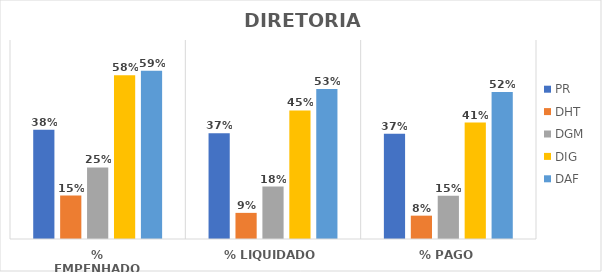
| Category | PR | DHT | DGM | DIG | DAF |
|---|---|---|---|---|---|
| % EMPENHADO | 0.384 | 0.153 | 0.252 | 0.576 | 0.592 |
| % LIQUIDADO | 0.372 | 0.092 | 0.184 | 0.452 | 0.528 |
| % PAGO | 0.37 | 0.082 | 0.152 | 0.409 | 0.517 |